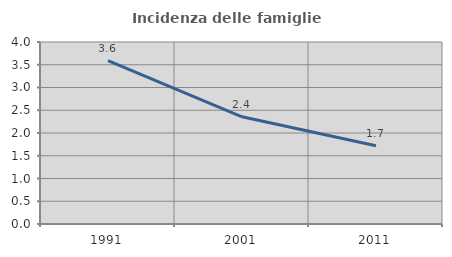
| Category | Incidenza delle famiglie numerose |
|---|---|
| 1991.0 | 3.59 |
| 2001.0 | 2.357 |
| 2011.0 | 1.718 |